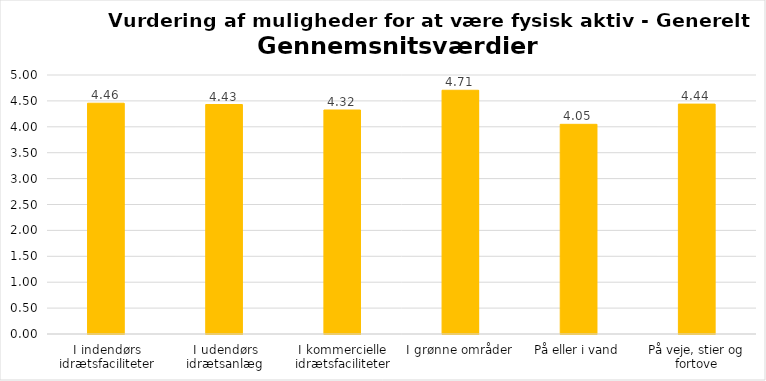
| Category | Gennemsnit |
|---|---|
| I indendørs idrætsfaciliteter | 4.455 |
| I udendørs idrætsanlæg | 4.43 |
| I kommercielle idrætsfaciliteter | 4.324 |
| I grønne områder | 4.706 |
| På eller i vand | 4.048 |
| På veje, stier og fortove | 4.438 |